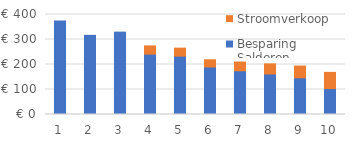
| Category | Besparing Salderen | Stroomverkoop |
|---|---|---|
| 1.0 | 373.8 | 0 |
| 2.0 | 316.56 | 0 |
| 3.0 | 329.52 | 0 |
| 4.0 | 241.58 | 32.76 |
| 5.0 | 233.496 | 31.824 |
| 6.0 | 190.08 | 28.8 |
| 7.0 | 174.96 | 35.1 |
| 8.0 | 162 | 40.5 |
| 9.0 | 146.88 | 46.8 |
| 10.0 | 103.68 | 64.8 |